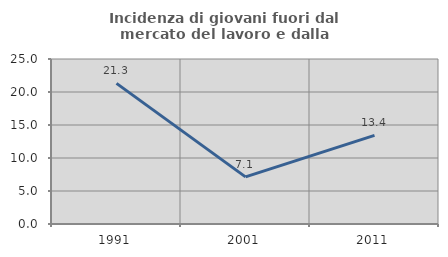
| Category | Incidenza di giovani fuori dal mercato del lavoro e dalla formazione  |
|---|---|
| 1991.0 | 21.311 |
| 2001.0 | 7.143 |
| 2011.0 | 13.423 |